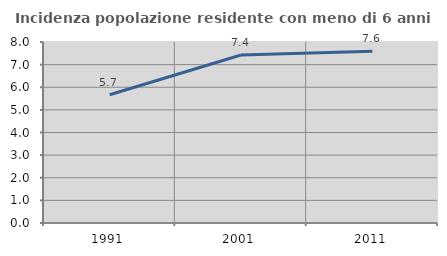
| Category | Incidenza popolazione residente con meno di 6 anni |
|---|---|
| 1991.0 | 5.669 |
| 2001.0 | 7.424 |
| 2011.0 | 7.587 |